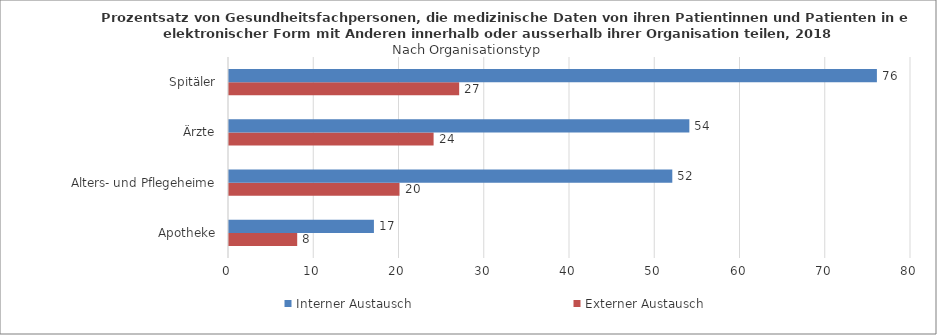
| Category | Externer Austausch | Interner Austausch |
|---|---|---|
| Apotheke | 8 | 17 |
| Alters- und Pflegeheime | 20 | 52 |
| Ärzte | 24 | 54 |
| Spitäler | 27 | 76 |